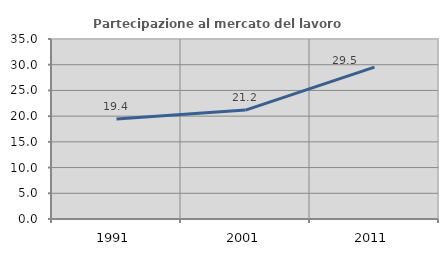
| Category | Partecipazione al mercato del lavoro  femminile |
|---|---|
| 1991.0 | 19.444 |
| 2001.0 | 21.171 |
| 2011.0 | 29.545 |